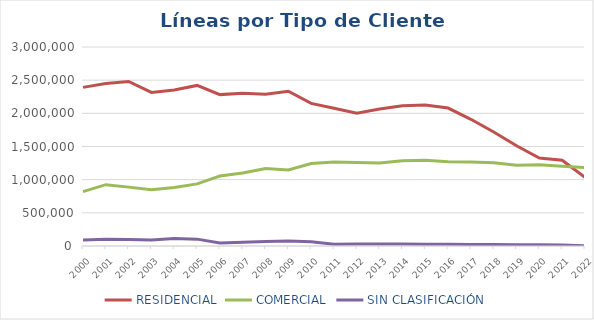
| Category | RESIDENCIAL | COMERCIAL | SIN CLASIFICACIÓN |
|---|---|---|---|
| 2000.0 | 2391600.86 | 820134.14 | 90763 |
| 2001.0 | 2450631.958 | 924449.042 | 103411 |
| 2002.0 | 2481214 | 887657 | 98142 |
| 2003.0 | 2315980 | 846524 | 89559 |
| 2004.0 | 2350770.912 | 882812.088 | 111519 |
| 2005.0 | 2420710.597 | 936558.403 | 103376 |
| 2006.0 | 2282170 | 1055019 | 46408 |
| 2007.0 | 2304237 | 1099345 | 56029 |
| 2008.0 | 2289075 | 1169557 | 66158 |
| 2009.0 | 2332952 | 1145936 | 76423 |
| 2010.0 | 2149852 | 1244093 | 65422 |
| 2011.0 | 2076184 | 1267963 | 25957 |
| 2012.0 | 2003235 | 1257853 | 31414 |
| 2013.0 | 2064536 | 1252954 | 29741 |
| 2014.0 | 2113422 | 1284776 | 29551 |
| 2015.0 | 2126562 | 1291291 | 28027 |
| 2016.0 | 2079358 | 1270087 | 25592 |
| 2017.0 | 1909980 | 1265880 | 24385 |
| 2018.0 | 1718412 | 1256588 | 22192 |
| 2019.0 | 1511530 | 1219199 | 19543 |
| 2020.0 | 1326881 | 1223748 | 17309 |
| 2021.0 | 1293415 | 1201023 | 16534 |
| 2022.0 | 1033282 | 1181492 | 2012 |